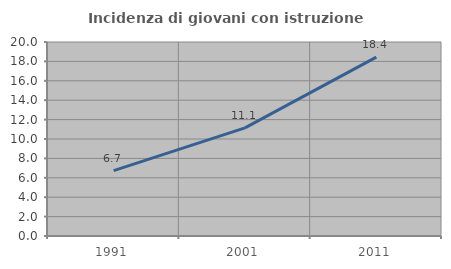
| Category | Incidenza di giovani con istruzione universitaria |
|---|---|
| 1991.0 | 6.734 |
| 2001.0 | 11.144 |
| 2011.0 | 18.447 |